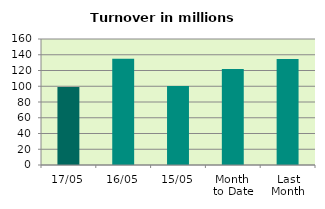
| Category | Series 0 |
|---|---|
| 17/05 | 99.174 |
| 16/05 | 134.858 |
| 15/05 | 100.257 |
| Month 
to Date | 121.787 |
| Last
Month | 134.694 |